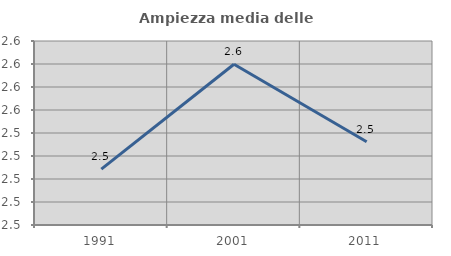
| Category | Ampiezza media delle famiglie |
|---|---|
| 1991.0 | 2.499 |
| 2001.0 | 2.59 |
| 2011.0 | 2.522 |